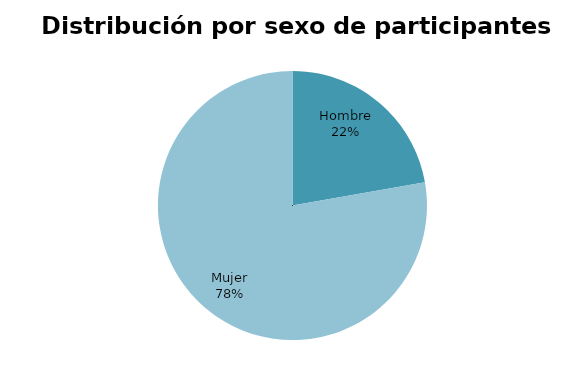
| Category | Series 0 |
|---|---|
| Hombre | 2 |
| Mujer | 7 |